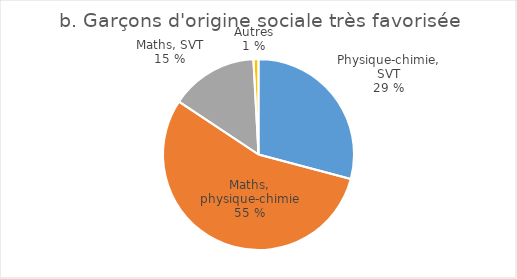
| Category | Garçons d'origine sociale très favorisée |
|---|---|
| Physique-chimie, SVT | 5707 |
| Mathématiques, physique-chimie | 10810 |
| Mathématiques, SVT | 2901 |
| Autres | 168 |